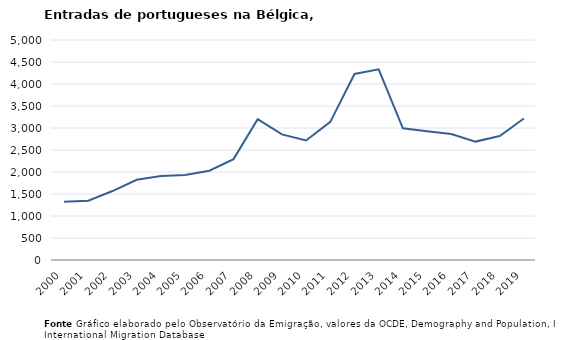
| Category | Entradas |
|---|---|
| 2000.0 | 1324 |
| 2001.0 | 1347 |
| 2002.0 | 1567 |
| 2003.0 | 1823 |
| 2004.0 | 1907 |
| 2005.0 | 1934 |
| 2006.0 | 2030 |
| 2007.0 | 2293 |
| 2008.0 | 3200 |
| 2009.0 | 2854 |
| 2010.0 | 2717 |
| 2011.0 | 3140 |
| 2012.0 | 4228 |
| 2013.0 | 4332 |
| 2014.0 | 2993 |
| 2015.0 | 2927 |
| 2016.0 | 2863 |
| 2017.0 | 2691 |
| 2018.0 | 2816 |
| 2019.0 | 3215 |